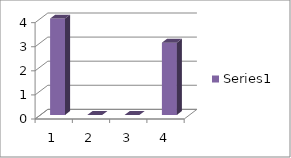
| Category | Series 0 |
|---|---|
| 0 | 4 |
| 1 | 0 |
| 2 | 0 |
| 3 | 3 |